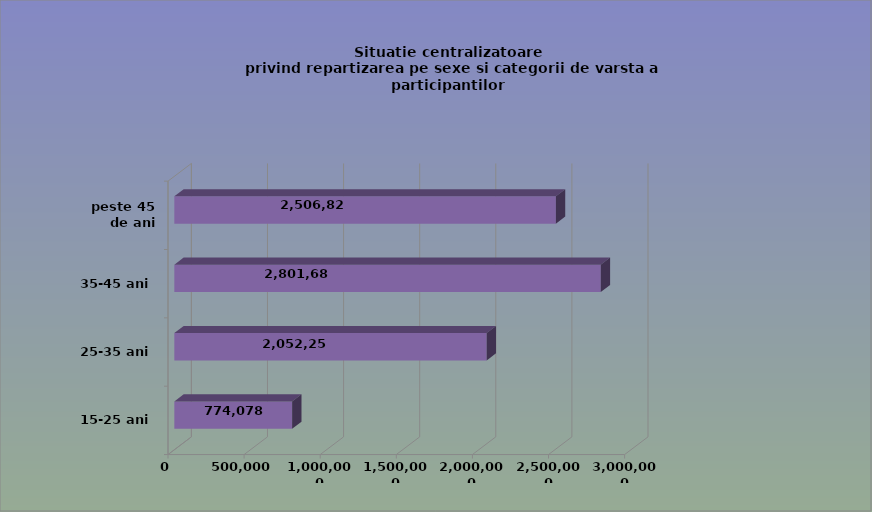
| Category | 15-25 ani 25-35 ani 35-45 ani peste 45 de ani |
|---|---|
| 15-25 ani | 774078 |
| 25-35 ani | 2052251 |
| 35-45 ani | 2801683 |
| peste 45 de ani | 2506826 |